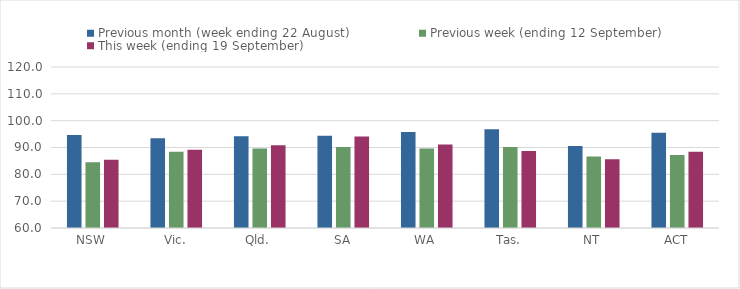
| Category | Previous month (week ending 22 August) | Previous week (ending 12 September) | This week (ending 19 September) |
|---|---|---|---|
| NSW | 94.64 | 84.51 | 85.41 |
| Vic. | 93.49 | 88.38 | 89.17 |
| Qld. | 94.18 | 89.6 | 90.81 |
| SA | 94.39 | 90.16 | 94.11 |
| WA | 95.74 | 89.6 | 91.1 |
| Tas. | 96.78 | 90.18 | 88.69 |
| NT | 90.53 | 86.6 | 85.65 |
| ACT | 95.49 | 87.25 | 88.44 |